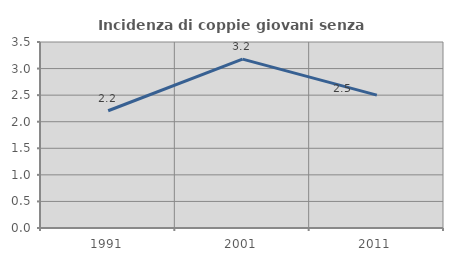
| Category | Incidenza di coppie giovani senza figli |
|---|---|
| 1991.0 | 2.206 |
| 2001.0 | 3.178 |
| 2011.0 | 2.5 |